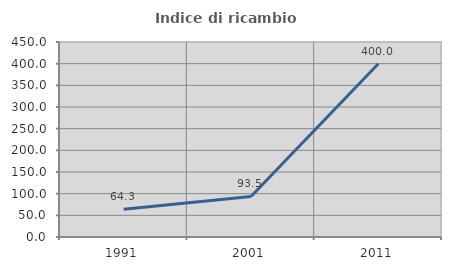
| Category | Indice di ricambio occupazionale  |
|---|---|
| 1991.0 | 64.286 |
| 2001.0 | 93.548 |
| 2011.0 | 400 |